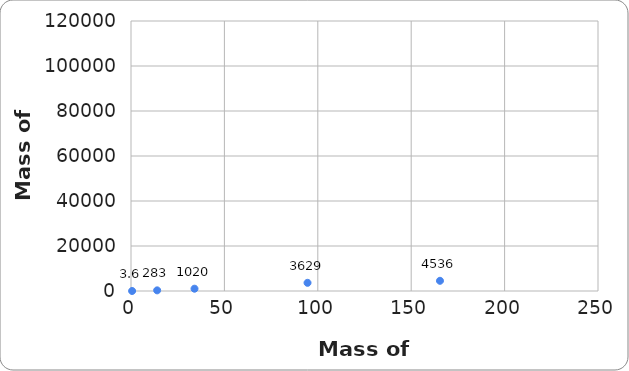
| Category | Series 0 |
|---|---|
| 1700.0 | 113380 |
| 165.4 | 4536 |
| 94.5 | 3629 |
| 34.0 | 1020 |
| 14.0 | 283 |
| 0.6 | 3.6 |